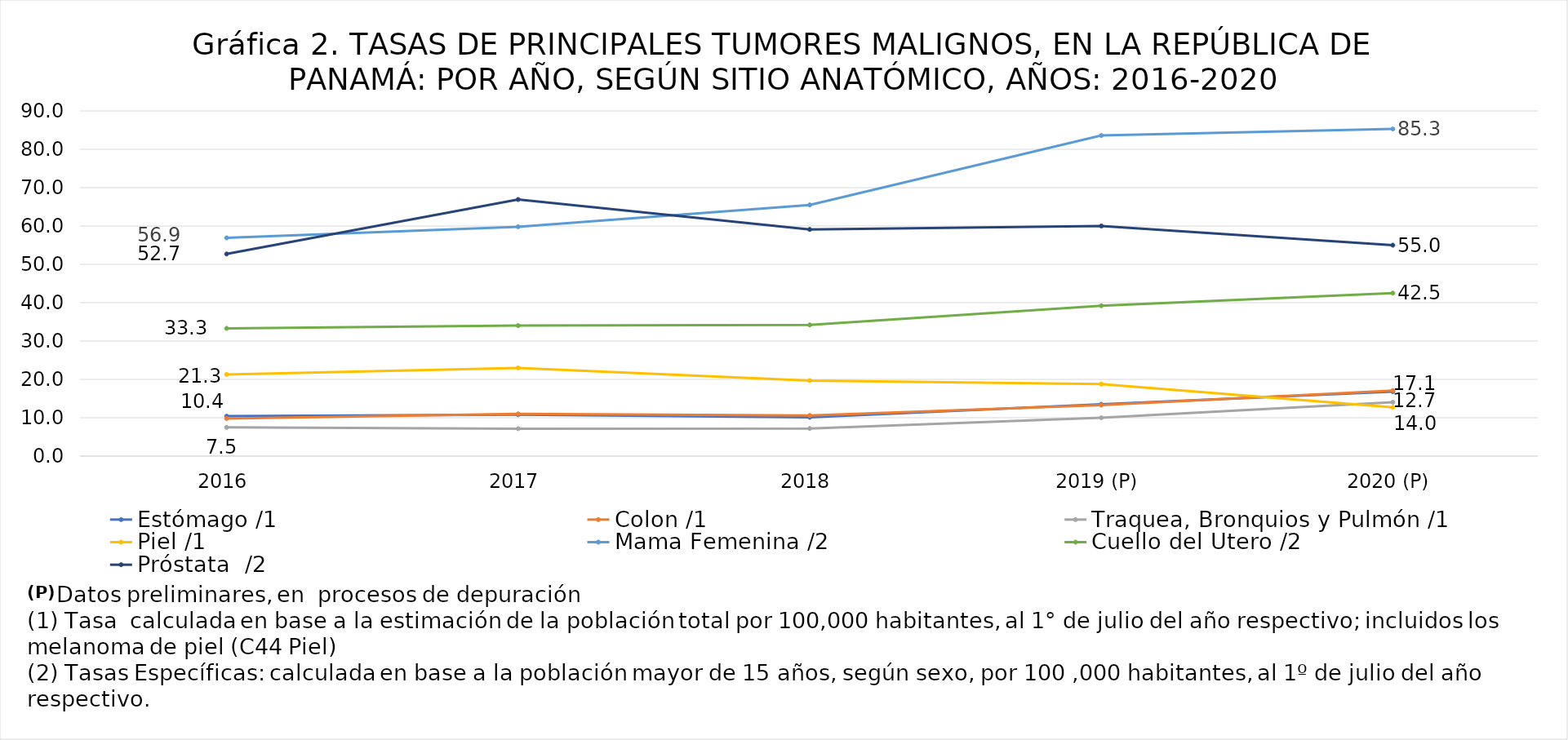
| Category | Estómago /1 | Colon /1 | Traquea, Bronquios y Pulmón /1 | Piel /1 | Mama Femenina /2 | Cuello del Utero /2 | Próstata  /2 |
|---|---|---|---|---|---|---|---|
| 2016 | 10.4 | 9.8 | 7.5 | 21.3 | 56.9 | 33.3 | 52.7 |
| 2017 | 10.8 | 11 | 7.15 | 23 | 59.8 | 34.02 | 66.92 |
| 2018 | 10.1 | 10.6 | 7.2 | 19.7 | 65.5 | 34.2 | 59.1 |
| 2019 (P) | 13.5 | 13.3 | 10 | 18.8 | 83.6 | 39.2 | 60 |
| 2020 (P) | 16.8 | 17.1 | 14.047 | 12.7 | 85.3 | 42.5 | 55 |